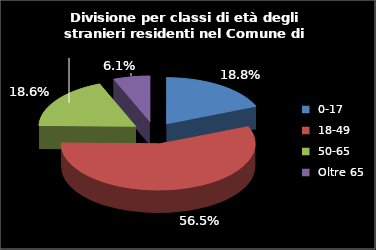
| Category | Series 0 |
|---|---|
| 0-17 | 402 |
| 18-49 | 1211 |
| 50-65 | 399 |
| Oltre 65 | 131 |